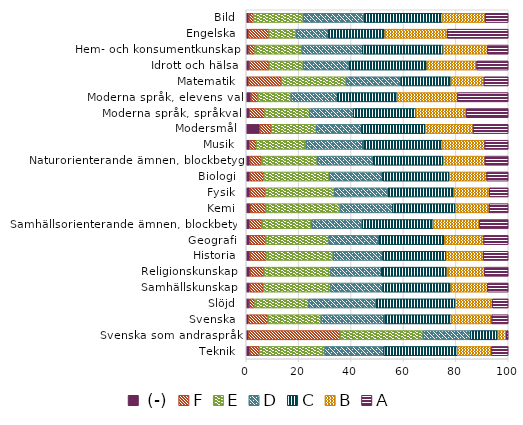
| Category |  (-) | F | E | D | C | B | A |
|---|---|---|---|---|---|---|---|
| Teknik | 1.356 | 3.618 | 24.919 | 22.572 | 28.133 | 13.023 | 6.38 |
| Svenska som andraspråk | 0.873 | 34.925 | 31.616 | 18.145 | 10.451 | 3.223 | 0.766 |
| Svenska | 0.861 | 7.365 | 20.284 | 24.043 | 25.796 | 15.358 | 6.293 |
| Slöjd | 1.115 | 2.117 | 20.552 | 25.65 | 30.359 | 14.131 | 6.075 |
| Samhällskunskap | 1.328 | 5.197 | 25.653 | 19.966 | 25.942 | 13.981 | 7.933 |
| Religionskunskap | 1.435 | 5.364 | 25.408 | 19.33 | 25.087 | 14.264 | 9.113 |
| Historia | 1.432 | 6.296 | 25.383 | 19.01 | 24.184 | 14.178 | 9.516 |
| Geografi | 1.306 | 6.185 | 23.946 | 19.047 | 25.15 | 14.965 | 9.401 |
| Samhällsorienterande ämnen, blockbetyg | 1.236 | 4.731 | 18.934 | 19.33 | 27.151 | 17.592 | 11.026 |
| Kemi | 1.499 | 6.018 | 28.278 | 20.06 | 24.044 | 12.779 | 7.322 |
| Fysik | 1.426 | 5.89 | 26.285 | 20.405 | 25.364 | 13.368 | 7.262 |
| Biologi | 1.381 | 5.322 | 24.992 | 20.35 | 25.486 | 14.256 | 8.214 |
| Naturorienterande ämnen, blockbetyg | 1.386 | 4.371 | 21.272 | 21.466 | 26.773 | 15.815 | 8.918 |
| Musik | 1.251 | 2.631 | 18.928 | 21.748 | 30.302 | 16.138 | 9.002 |
| Modersmål | 5.174 | 4.368 | 17.216 | 17.305 | 24.309 | 18.184 | 13.444 |
| Moderna språk, språkval | 1.142 | 5.903 | 17.119 | 16.702 | 23.876 | 19.177 | 16.081 |
| Moderna språk, elevens val | 1.795 | 2.693 | 12.567 | 17.774 | 22.801 | 22.98 | 19.39 |
| Matematik | 0.876 | 12.476 | 24.746 | 20.926 | 19.147 | 12.558 | 9.271 |
| Idrott och hälsa | 1.12 | 7.577 | 12.995 | 17.636 | 29.591 | 19.045 | 12.035 |
| Hem- och konsumentkunskap | 0.986 | 2.268 | 17.959 | 23.163 | 30.741 | 16.945 | 7.938 |
| Engelska | 0.862 | 7.761 | 10.399 | 12.385 | 21.448 | 23.932 | 23.213 |
| Bild | 1.036 | 1.756 | 18.919 | 23.125 | 30.057 | 16.259 | 8.848 |